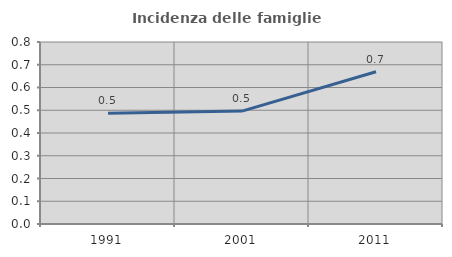
| Category | Incidenza delle famiglie numerose |
|---|---|
| 1991.0 | 0.487 |
| 2001.0 | 0.496 |
| 2011.0 | 0.669 |